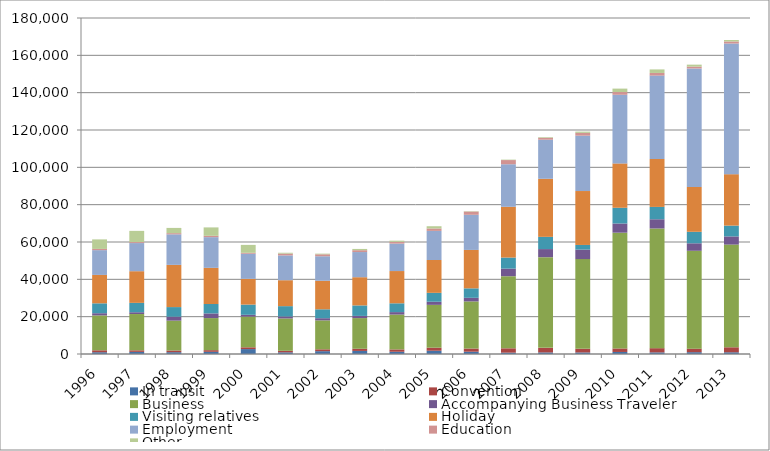
| Category | In transit | Convention | Business | Accompanying Business Traveler | Visiting relatives | Holiday | Employment | Education | Other |
|---|---|---|---|---|---|---|---|---|---|
| 1996.0 | 954 | 1037 | 18682 | 1179 | 5297 | 15217 | 13276 | 649 | 5101 |
| 1997.0 | 1138 | 845 | 19429 | 963 | 5018 | 16965 | 15069 | 532 | 6001 |
| 1998.0 | 973 | 914 | 15986 | 2112 | 5150 | 22616 | 16361 | 631 | 2802 |
| 1999.0 | 1168 | 897 | 17175 | 2501 | 5045 | 19370 | 16444 | 723 | 4493 |
| 2000.0 | 2643 | 948 | 16441 | 965 | 5474 | 13792 | 13439 | 511 | 4235 |
| 2001.0 | 895 | 820 | 17331 | 1053 | 5536 | 13896 | 13279 | 973 | 452 |
| 2002.0 | 1519 | 998 | 15492 | 1171 | 4765 | 15279 | 13138 | 1054 | 346 |
| 2003.0 | 1645 | 1157 | 16427 | 1175 | 5625 | 15112 | 13480 | 987 | 674 |
| 2004.0 | 1202 | 1263 | 18663 | 1314 | 4719 | 17280 | 14707 | 951 | 616 |
| 2005.0 | 1745 | 1635 | 22947 | 1671 | 4766 | 17584 | 15598 | 1301 | 1203 |
| 2006.0 | 1235 | 1704 | 25231 | 1929 | 5073 | 20584 | 18815 | 1744 | 189 |
| 2007.0 | 732 | 2320 | 38633 | 4051 | 5926 | 27198 | 22793 | 2244 | 225 |
| 2008.0 | 849 | 2434 | 48588 | 4337 | 6552 | 31103 | 20941 | 1030 | 324 |
| 2009.0 | 836 | 1958 | 48043 | 5095 | 2487 | 28886 | 29658 | 1510 | 658 |
| 2010.0 | 1092 | 1877 | 62020 | 4924 | 8426 | 23774 | 36756 | 1459 | 1850 |
| 2011.0 | 871 | 2259 | 64105 | 4947 | 6614 | 25672 | 44675 | 1420 | 1891 |
| 2012.0 | 973 | 1883 | 52435 | 4016 | 6152 | 24013 | 63503 | 994 | 1039 |
| 2013.0 | 917 | 2682 | 55026 | 4376 | 5786 | 27544 | 70008 | 1087 | 786 |